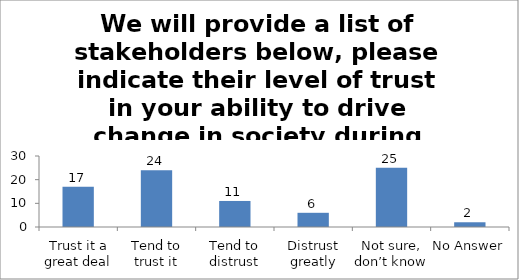
| Category | We will provide a list of stakeholders below, please indicate their level of trust in your ability to drive change in society during studies. (Non-profit institutions ) |
|---|---|
| Trust it a great deal | 17 |
| Tend to trust it | 24 |
| Tend to distrust | 11 |
| Distrust greatly | 6 |
| Not sure, don’t know | 25 |
| No Answer | 2 |